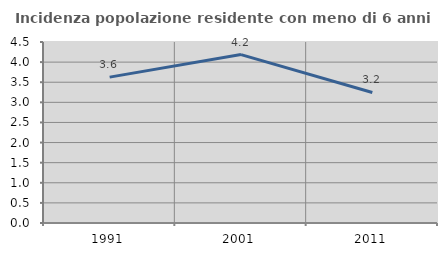
| Category | Incidenza popolazione residente con meno di 6 anni |
|---|---|
| 1991.0 | 3.626 |
| 2001.0 | 4.187 |
| 2011.0 | 3.246 |